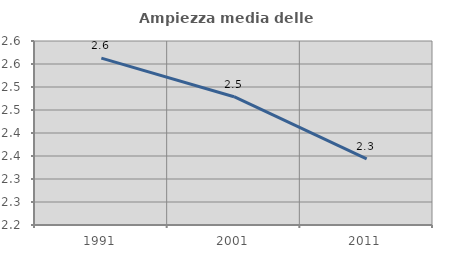
| Category | Ampiezza media delle famiglie |
|---|---|
| 1991.0 | 2.563 |
| 2001.0 | 2.479 |
| 2011.0 | 2.344 |